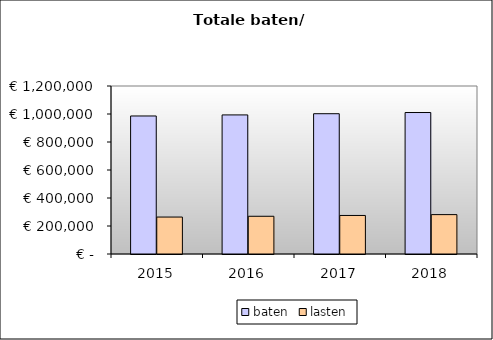
| Category | baten | lasten |
|---|---|---|
| 2015.0 | 985907.235 | 263904.48 |
| 2016.0 | 993475.143 | 269506.44 |
| 2017.0 | 1002038.183 | 275310.9 |
| 2018.0 | 1010601.223 | 281337.3 |